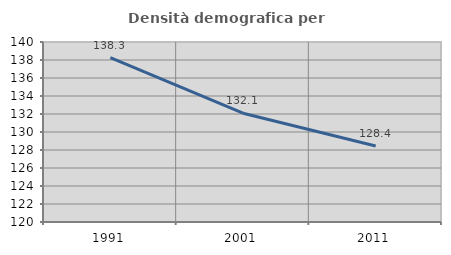
| Category | Densità demografica |
|---|---|
| 1991.0 | 138.254 |
| 2001.0 | 132.085 |
| 2011.0 | 128.444 |